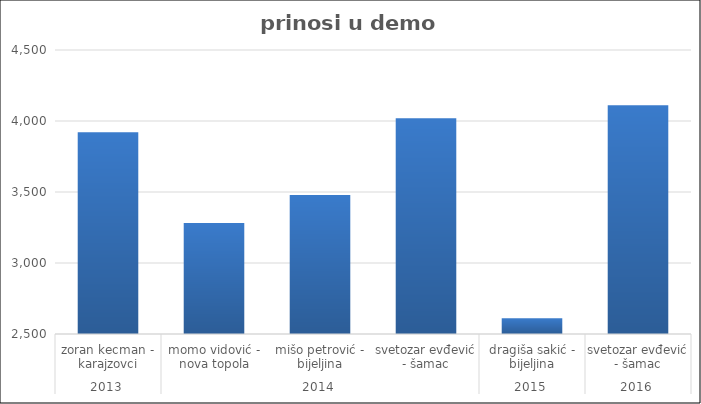
| Category | Series 0 |
|---|---|
| 0 | 3921.4 |
| 1 | 3281.2 |
| 2 | 3478.3 |
| 3 | 4020 |
| 4 | 2611 |
| 5 | 4111 |